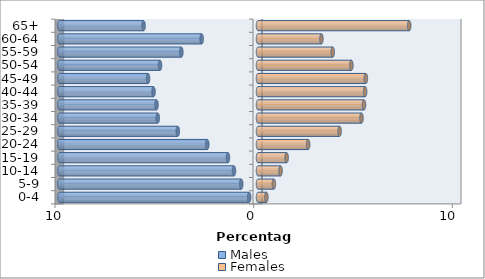
| Category | Males | Females |
|---|---|---|
| 0-4 | -0.444 | 0.423 |
| 5-9 | -0.845 | 0.798 |
| 10-14 | -1.21 | 1.135 |
| 15-19 | -1.512 | 1.443 |
| 20-24 | -2.554 | 2.525 |
| 25-29 | -4.037 | 4.108 |
| 30-34 | -5.045 | 5.209 |
| 35-39 | -5.109 | 5.335 |
| 40-44 | -5.259 | 5.393 |
| 45-49 | -5.533 | 5.429 |
| 50-54 | -4.932 | 4.701 |
| 55-59 | -3.859 | 3.763 |
| 60-64 | -2.835 | 3.192 |
| 65+ | -5.76 | 7.612 |